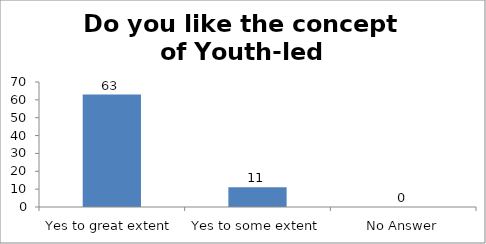
| Category | Do you like the concept of Youth-led Changemaking?  |
|---|---|
| Yes to great extent | 63 |
| Yes to some extent | 11 |
| No Answer | 0 |